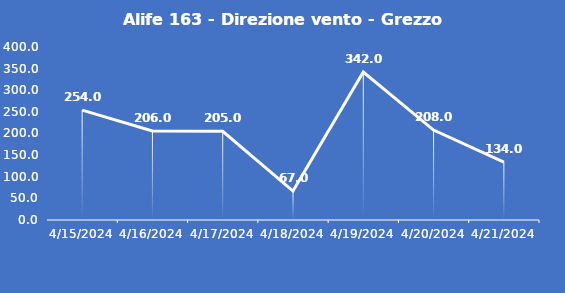
| Category | Alife 163 - Direzione vento - Grezzo (°N) |
|---|---|
| 4/15/24 | 254 |
| 4/16/24 | 206 |
| 4/17/24 | 205 |
| 4/18/24 | 67 |
| 4/19/24 | 342 |
| 4/20/24 | 208 |
| 4/21/24 | 134 |